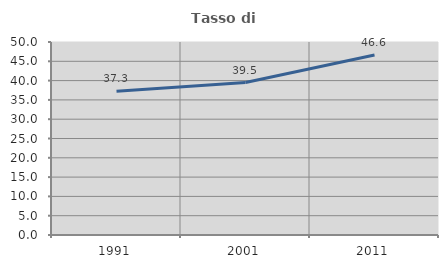
| Category | Tasso di occupazione   |
|---|---|
| 1991.0 | 37.253 |
| 2001.0 | 39.484 |
| 2011.0 | 46.635 |